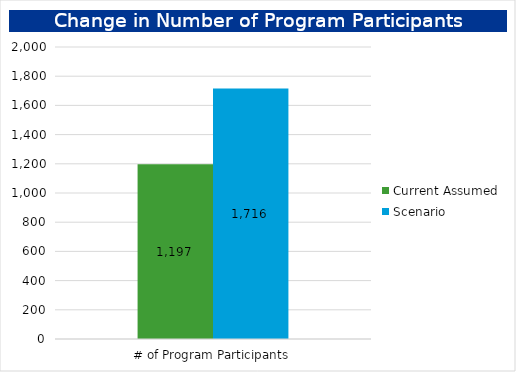
| Category | Current Assumed | Scenario |
|---|---|---|
| # of Program Participants | 1197 | 1716.267 |